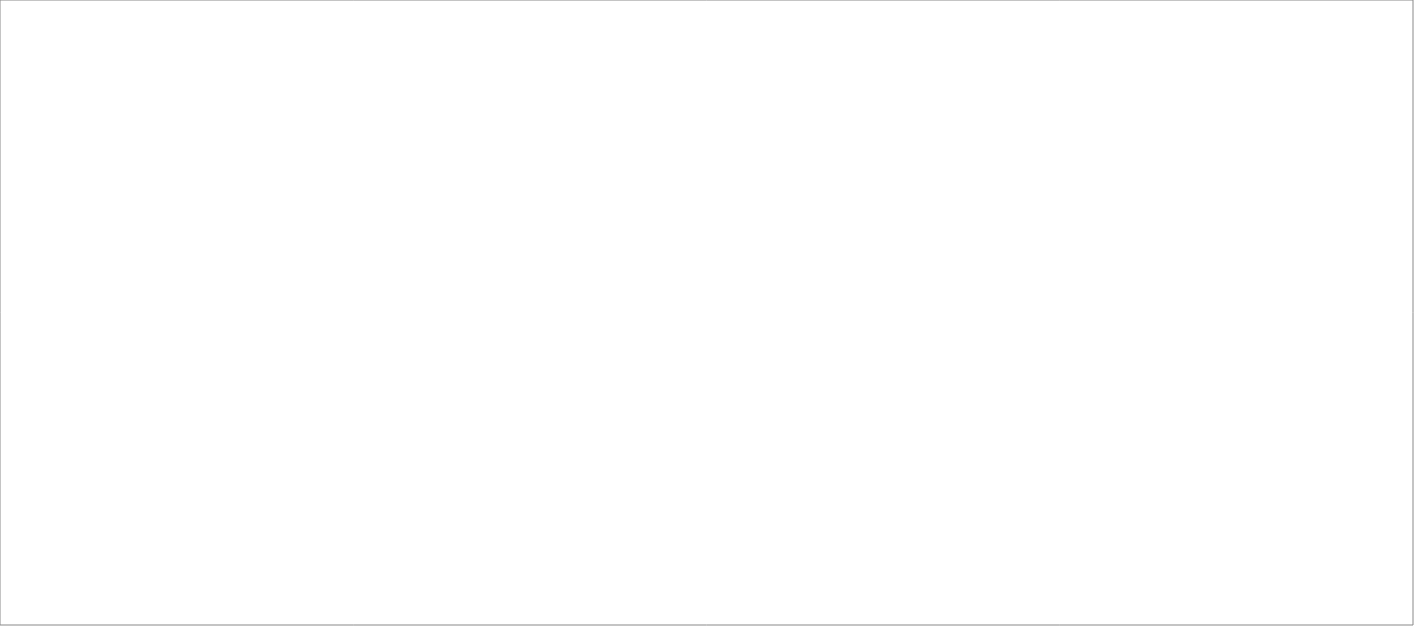
| Category | Total |
|---|---|
| Poolia Sverige AB | 85 |
| Clockwork Bemanning & Rekrytering AB | 85 |
| Randstad AB | 76.6 |
| Wise Professionals AB | 65 |
| Experis AB | 50.8 |